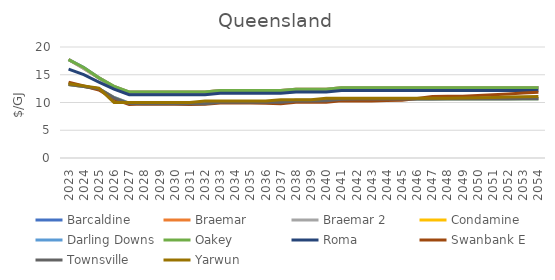
| Category | Barcaldine | Braemar | Braemar 2 | Condamine | Darling Downs | Oakey | Roma | Swanbank E | Townsville | Yarwun |
|---|---|---|---|---|---|---|---|---|---|---|
| 2023.0 | 17.731 | 17.758 | 17.758 | 13.261 | 13.261 | 17.731 | 16.025 | 13.652 | 13.261 | 13.372 |
| 2024.0 | 16.303 | 16.139 | 16.139 | 12.882 | 12.882 | 16.303 | 15.01 | 12.985 | 12.882 | 12.994 |
| 2025.0 | 14.44 | 14.434 | 14.434 | 12.486 | 12.486 | 14.44 | 13.682 | 12.25 | 12.486 | 12.597 |
| 2026.0 | 12.831 | 12.883 | 12.883 | 10.897 | 10.897 | 12.897 | 12.397 | 10.6 | 10.831 | 10.008 |
| 2027.0 | 11.807 | 11.885 | 11.885 | 9.897 | 9.897 | 11.897 | 11.397 | 9.648 | 9.807 | 10.008 |
| 2028.0 | 11.781 | 11.891 | 11.891 | 9.897 | 9.897 | 11.897 | 11.397 | 9.716 | 9.781 | 10.008 |
| 2029.0 | 11.77 | 11.892 | 11.892 | 9.897 | 9.897 | 11.897 | 11.397 | 9.665 | 9.77 | 10.008 |
| 2030.0 | 11.774 | 11.893 | 11.893 | 9.897 | 9.897 | 11.897 | 11.397 | 9.673 | 9.774 | 10.008 |
| 2031.0 | 11.775 | 11.893 | 11.893 | 9.897 | 9.897 | 11.897 | 11.397 | 9.654 | 9.775 | 10.008 |
| 2032.0 | 11.791 | 11.892 | 11.892 | 9.897 | 9.897 | 11.897 | 11.397 | 9.665 | 9.791 | 10.258 |
| 2033.0 | 12.036 | 12.142 | 12.142 | 10.147 | 10.147 | 12.147 | 11.647 | 9.923 | 10.036 | 10.258 |
| 2034.0 | 12.038 | 12.142 | 12.142 | 10.147 | 10.147 | 12.147 | 11.647 | 9.923 | 10.038 | 10.258 |
| 2035.0 | 12.054 | 12.142 | 12.142 | 10.147 | 10.147 | 12.147 | 11.647 | 9.915 | 10.054 | 10.258 |
| 2036.0 | 12.054 | 12.143 | 12.143 | 10.147 | 10.147 | 12.147 | 11.647 | 9.861 | 10.054 | 10.258 |
| 2037.0 | 12.066 | 12.143 | 12.143 | 10.147 | 10.147 | 12.147 | 11.647 | 9.792 | 10.066 | 10.508 |
| 2038.0 | 12.29 | 12.391 | 12.391 | 10.397 | 10.397 | 12.397 | 11.897 | 10.042 | 10.29 | 10.508 |
| 2039.0 | 12.293 | 12.389 | 12.389 | 10.397 | 10.397 | 12.397 | 11.897 | 10.042 | 10.293 | 10.508 |
| 2040.0 | 12.321 | 12.392 | 12.392 | 10.397 | 10.397 | 12.397 | 11.897 | 10.042 | 10.321 | 10.758 |
| 2041.0 | 12.587 | 12.643 | 12.643 | 10.647 | 10.647 | 12.647 | 12.147 | 10.308 | 10.587 | 10.758 |
| 2042.0 | 12.638 | 12.641 | 12.641 | 10.647 | 10.647 | 12.647 | 12.147 | 10.292 | 10.638 | 10.758 |
| 2043.0 | 12.646 | 12.642 | 12.642 | 10.647 | 10.647 | 12.647 | 12.147 | 10.292 | 10.646 | 10.758 |
| 2044.0 | 12.646 | 12.642 | 12.642 | 10.647 | 10.647 | 12.647 | 12.147 | 10.353 | 10.646 | 10.758 |
| 2045.0 | 12.646 | 12.638 | 12.638 | 10.647 | 10.647 | 12.647 | 12.147 | 10.42 | 10.646 | 10.758 |
| 2046.0 | 12.646 | 12.643 | 12.643 | 10.647 | 10.647 | 12.647 | 12.147 | 10.728 | 10.646 | 10.758 |
| 2047.0 | 12.646 | 12.641 | 12.641 | 10.647 | 10.647 | 12.647 | 12.147 | 11.077 | 10.646 | 10.758 |
| 2048.0 | 12.668 | 12.642 | 12.642 | 10.647 | 10.647 | 12.647 | 12.147 | 11.113 | 10.668 | 10.758 |
| 2049.0 | 12.677 | 12.646 | 12.646 | 10.647 | 10.647 | 12.647 | 12.147 | 11.115 | 10.677 | 10.812 |
| 2050.0 | 12.683 | 12.647 | 12.647 | 10.647 | 10.647 | 12.647 | 12.147 | 11.259 | 10.683 | 10.866 |
| 2051.0 | 12.689 | 12.649 | 12.649 | 10.647 | 10.647 | 12.647 | 12.147 | 11.405 | 10.689 | 10.92 |
| 2052.0 | 12.695 | 12.65 | 12.65 | 10.647 | 10.647 | 12.647 | 12.147 | 11.553 | 10.695 | 10.975 |
| 2053.0 | 12.701 | 12.652 | 12.652 | 10.647 | 10.647 | 12.647 | 12.147 | 11.703 | 10.701 | 11.029 |
| 2054.0 | 12.707 | 12.653 | 12.653 | 10.647 | 10.647 | 12.647 | 12.147 | 11.855 | 10.707 | 11.085 |